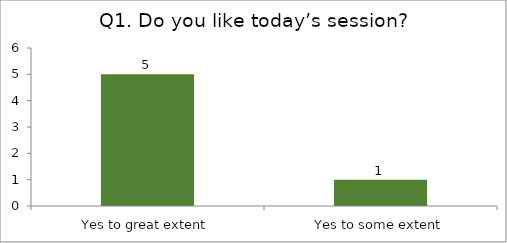
| Category | Q1. Do you like today’s session? |
|---|---|
| Yes to great extent | 5 |
| Yes to some extent | 1 |